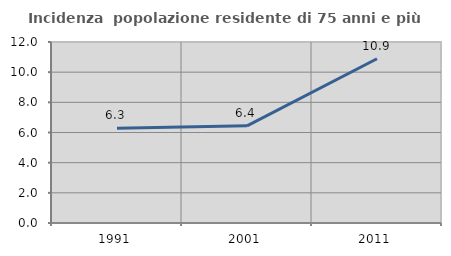
| Category | Incidenza  popolazione residente di 75 anni e più |
|---|---|
| 1991.0 | 6.285 |
| 2001.0 | 6.443 |
| 2011.0 | 10.89 |